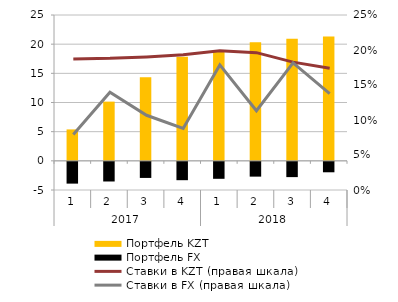
| Category | Портфель KZT | Портфель FX |
|---|---|---|
| 0 | 5.385 | -3.734 |
| 1 | 10.15 | -3.369 |
| 2 | 14.33 | -2.759 |
| 3 | 17.853 | -3.148 |
| 4 | 18.93 | -2.909 |
| 5 | 20.347 | -2.536 |
| 6 | 20.921 | -2.62 |
| 7 | 21.331 | -1.792 |